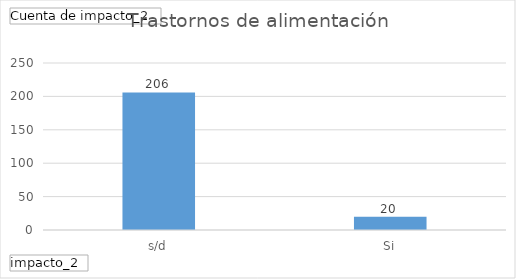
| Category | Total |
|---|---|
| s/d | 206 |
| Si | 20 |